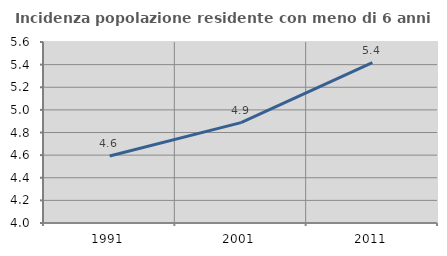
| Category | Incidenza popolazione residente con meno di 6 anni |
|---|---|
| 1991.0 | 4.592 |
| 2001.0 | 4.887 |
| 2011.0 | 5.418 |